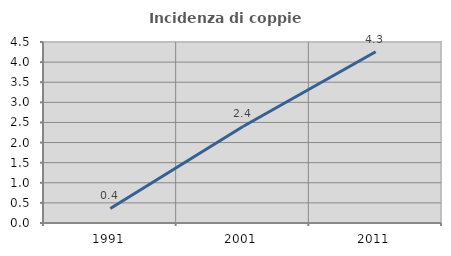
| Category | Incidenza di coppie miste |
|---|---|
| 1991.0 | 0.361 |
| 2001.0 | 2.4 |
| 2011.0 | 4.259 |